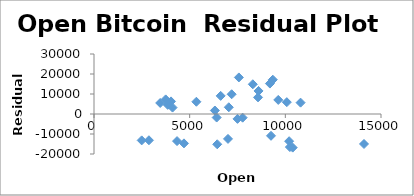
| Category | Series 0 |
|---|---|
| 2492.600098 | -13193.129 |
| 2871.300049 | -13126.335 |
| 4701.759766 | -14687.402 |
| 4341.049805 | -13551.22 |
| 6440.970215 | -15135.72 |
| 10198.599609 | -13606.501 |
| 14112.200195 | -14986.742 |
| 10237.299805 | -16536.645 |
| 10385.0 | -16810.382 |
| 7003.060059 | -12451.515 |
| 9251.469727 | -10902.213 |
| 7500.700195 | -2440.887 |
| 6411.680176 | -1768.675 |
| 7769.040039 | -1835.151 |
| 7044.810059 | 3366.636 |
| 6619.850098 | 9056.775 |
| 6318.140137 | 1749.027 |
| 4024.464355 | 6302.531 |
| 3746.713379 | 7301.993 |
| 3460.547119 | 5516.827 |
| 3853.75708 | 4571.144 |
| 4105.362305 | 3206.591 |
| 5350.914551 | 6118.133 |
| 8573.839844 | 8316.83 |
| 10796.930664 | 5673.57 |
| 10077.442383 | 5915.596 |
| 9630.592773 | 7036.843 |
| 8299.720703 | 14860.297 |
| 9193.992188 | 15215.715 |
| 7571.616211 | 18281.36 |
| 7194.89209 | 9869.615 |
| 9346.357422 | 17144.141 |
| 8599.758789 | 11528.895 |